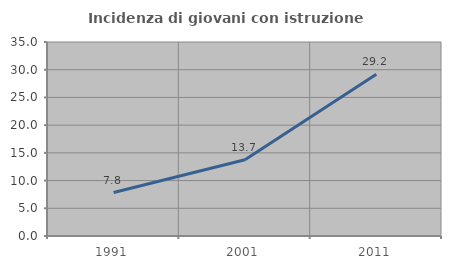
| Category | Incidenza di giovani con istruzione universitaria |
|---|---|
| 1991.0 | 7.835 |
| 2001.0 | 13.744 |
| 2011.0 | 29.167 |